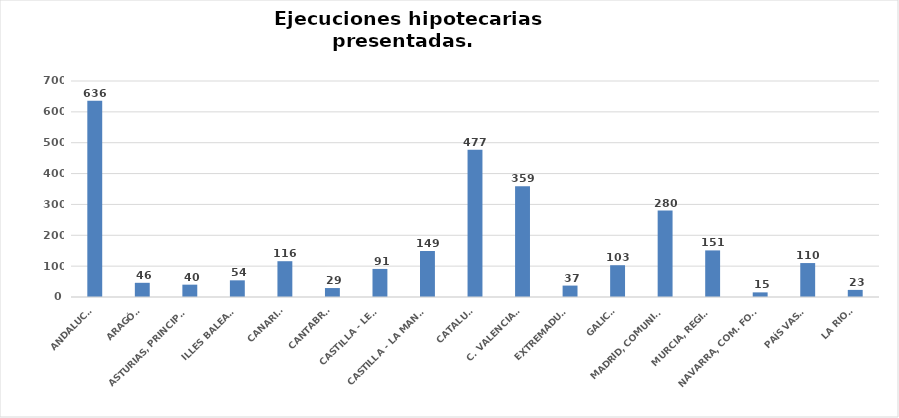
| Category | Series 0 |
|---|---|
| ANDALUCÍA | 636 |
| ARAGÓN | 46 |
| ASTURIAS, PRINCIPADO | 40 |
| ILLES BALEARS | 54 |
| CANARIAS | 116 |
| CANTABRIA | 29 |
| CASTILLA - LEÓN | 91 |
| CASTILLA - LA MANCHA | 149 |
| CATALUÑA | 477 |
| C. VALENCIANA | 359 |
| EXTREMADURA | 37 |
| GALICIA | 103 |
| MADRID, COMUNIDAD | 280 |
| MURCIA, REGIÓN | 151 |
| NAVARRA, COM. FORAL | 15 |
| PAÍS VASCO | 110 |
| LA RIOJA | 23 |